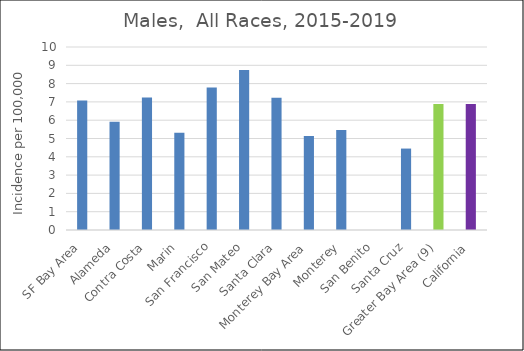
| Category | Male |
|---|---|
| SF Bay Area | 7.07 |
|   Alameda | 5.91 |
|   Contra Costa | 7.24 |
|   Marin | 5.32 |
|   San Francisco | 7.79 |
|   San Mateo | 8.75 |
|   Santa Clara | 7.22 |
| Monterey Bay Area | 5.13 |
|   Monterey | 5.47 |
|   San Benito | 0 |
|   Santa Cruz | 4.45 |
| Greater Bay Area (9) | 6.88 |
| California | 6.88 |